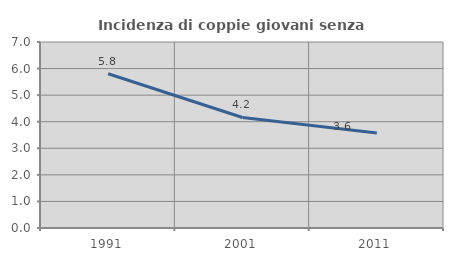
| Category | Incidenza di coppie giovani senza figli |
|---|---|
| 1991.0 | 5.805 |
| 2001.0 | 4.159 |
| 2011.0 | 3.571 |